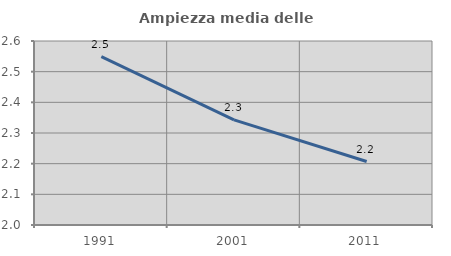
| Category | Ampiezza media delle famiglie |
|---|---|
| 1991.0 | 2.549 |
| 2001.0 | 2.343 |
| 2011.0 | 2.207 |